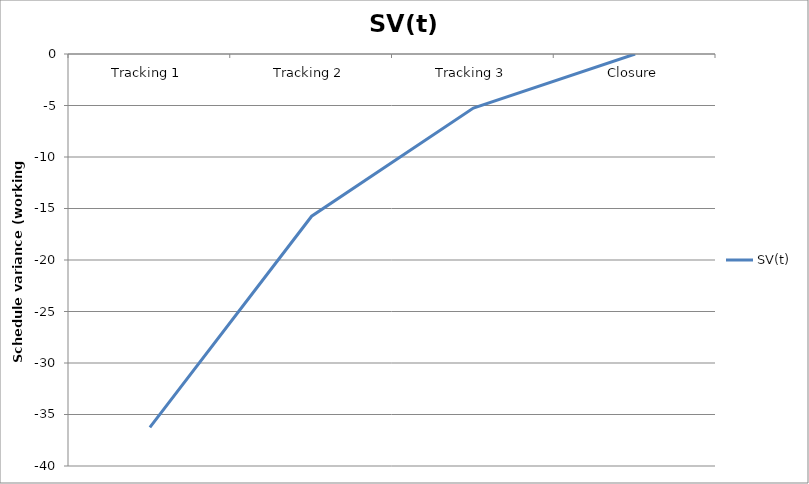
| Category | SV(t) |
|---|---|
| Tracking 1 | -36.25 |
| Tracking 2 | -15.75 |
| Tracking 3 | -5.25 |
| Closure | 0 |